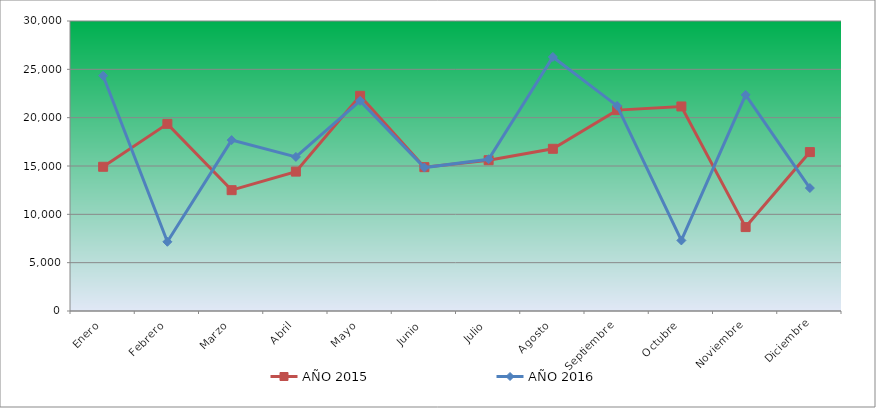
| Category | AÑO 2015 | AÑO 2016 |
|---|---|---|
| Enero | 14920 | 24340 |
| Febrero | 19360 | 7160 |
| Marzo | 12500 | 17680 |
| Abril | 14420 | 15940 |
| Mayo | 22260 | 21740 |
| Junio | 14880 | 14840 |
| Julio | 15600 | 15700 |
| Agosto | 16780 | 26280 |
| Septiembre | 20780 | 21220 |
| Octubre | 21160 | 7300 |
| Noviembre | 8680 | 22360 |
| Diciembre | 16440 | 12720 |